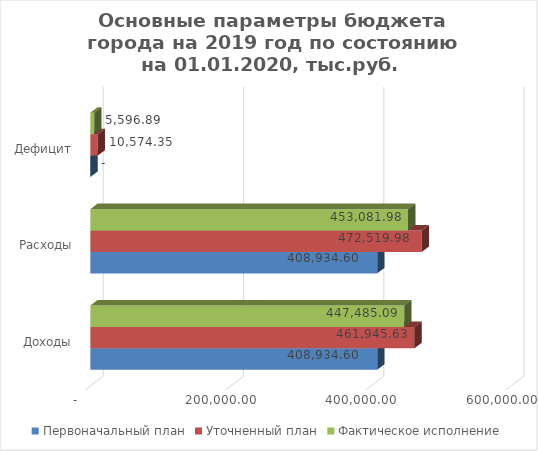
| Category | Первоначальный план | Уточненный план | Фактическое исполнение |
|---|---|---|---|
| Доходы | 408934.598 | 461945.632 | 447485.089 |
| Расходы | 408934.598 | 472519.981 | 453081.976 |
| Дефицит | 0 | 10574.348 | 5596.887 |